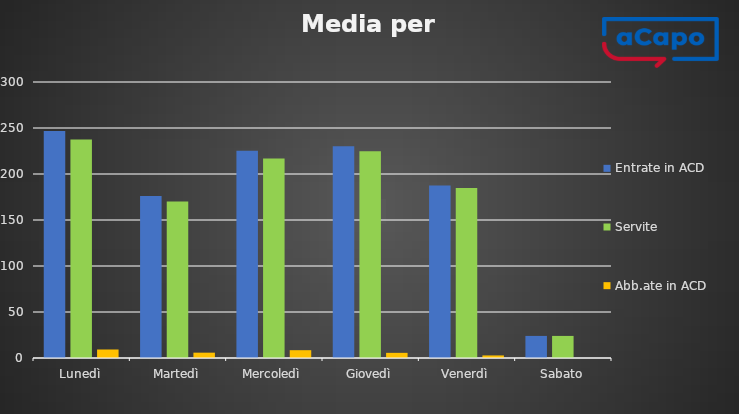
| Category | Entrate in ACD | Servite | Abb.ate in ACD |
|---|---|---|---|
| Lunedì | 246.75 | 237.5 | 9.25 |
| Martedì | 176 | 170.2 | 5.8 |
| Mercoledì | 225.25 | 216.75 | 8.5 |
| Giovedì | 230.2 | 224.6 | 5.6 |
| Venerdì | 187.6 | 184.8 | 2.8 |
| Sabato | 24 | 24 | 0 |